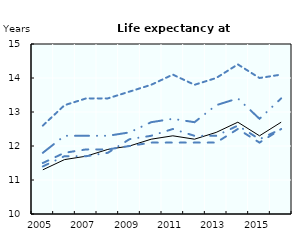
| Category | EU28 | Germany | France | Italy | United Kingdom |
|---|---|---|---|---|---|
| 2005.0 | 11.3 | 11.5 | 12.6 | 11.8 | 11.4 |
| 2006.0 | 11.6 | 11.8 | 13.2 | 12.3 | 11.7 |
| 2007.0 | 11.7 | 11.9 | 13.4 | 12.3 | 11.7 |
| 2008.0 | 11.9 | 11.9 | 13.4 | 12.3 | 11.8 |
| 2009.0 | 12 | 12 | 13.6 | 12.4 | 12.2 |
| 2010.0 | 12.2 | 12.1 | 13.8 | 12.7 | 12.3 |
| 2011.0 | 12.3 | 12.1 | 14.1 | 12.8 | 12.5 |
| 2012.0 | 12.2 | 12.1 | 13.8 | 12.7 | 12.3 |
| 2013.0 | 12.4 | 12.1 | 14 | 13.2 | 12.3 |
| 2014.0 | 12.7 | 12.5 | 14.4 | 13.4 | 12.6 |
| 2015.0 | 12.3 | 12.1 | 14 | 12.8 | 12.2 |
| 2016.0 | 12.7 | 12.5 | 14.1 | 13.4 | 12.5 |